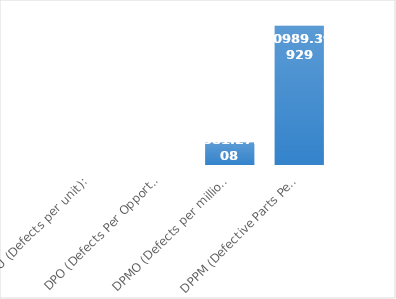
| Category | Series 0 |
|---|---|
| DPU (Defects per unit): | 0.053 |
| DPO (Defects Per Opportunity): | 0.007 |
| DPMO (Defects per million opportunities): | 6581.272 |
| DPPM (Defective Parts Per Million) : | 40989.399 |